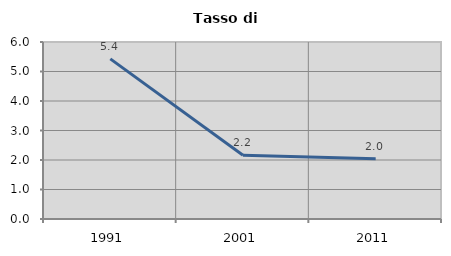
| Category | Tasso di disoccupazione   |
|---|---|
| 1991.0 | 5.429 |
| 2001.0 | 2.161 |
| 2011.0 | 2.043 |